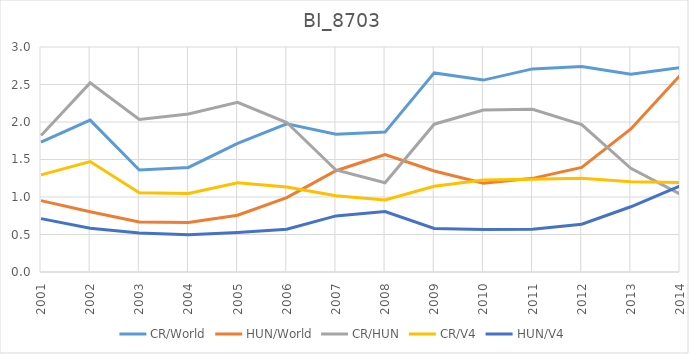
| Category | CR/World | HUN/World | CR/HUN | CR/V4 | HUN/V4 | RCA |
|---|---|---|---|---|---|---|
| 2001.0 | 1.732 | 0.952 | 1.82 | 1.294 | 0.711 |  |
| 2002.0 | 2.025 | 0.803 | 2.522 | 1.473 | 0.584 |  |
| 2003.0 | 1.359 | 0.668 | 2.035 | 1.057 | 0.519 |  |
| 2004.0 | 1.394 | 0.661 | 2.108 | 1.048 | 0.497 |  |
| 2005.0 | 1.714 | 0.758 | 2.262 | 1.191 | 0.526 |  |
| 2006.0 | 1.976 | 0.992 | 1.993 | 1.134 | 0.569 |  |
| 2007.0 | 1.837 | 1.35 | 1.36 | 1.017 | 0.748 |  |
| 2008.0 | 1.865 | 1.567 | 1.19 | 0.959 | 0.806 |  |
| 2009.0 | 2.655 | 1.347 | 1.971 | 1.144 | 0.58 |  |
| 2010.0 | 2.559 | 1.185 | 2.16 | 1.226 | 0.568 |  |
| 2011.0 | 2.708 | 1.249 | 2.169 | 1.238 | 0.571 |  |
| 2012.0 | 2.739 | 1.394 | 1.965 | 1.251 | 0.637 |  |
| 2013.0 | 2.637 | 1.907 | 1.383 | 1.203 | 0.87 |  |
| 2014.0 | 2.724 | 2.621 | 1.039 | 1.193 | 1.148 |  |